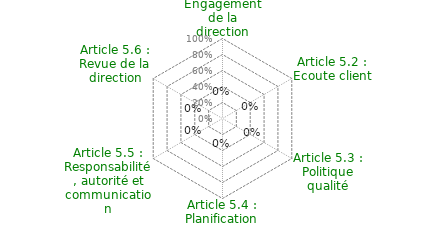
| Category | Article 5 : Responsabilité de la direction |
|---|---|
| Article 5.1 : Engagement de la direction | 0 |
| Article 5.2 : Ecoute client | 0 |
| Article 5.3 : Politique qualité | 0 |
| Article 5.4 : Planification | 0 |
| Article 5.5 : Responsabilité, autorité et communication | 0 |
| Article 5.6 : Revue de la direction | 0 |